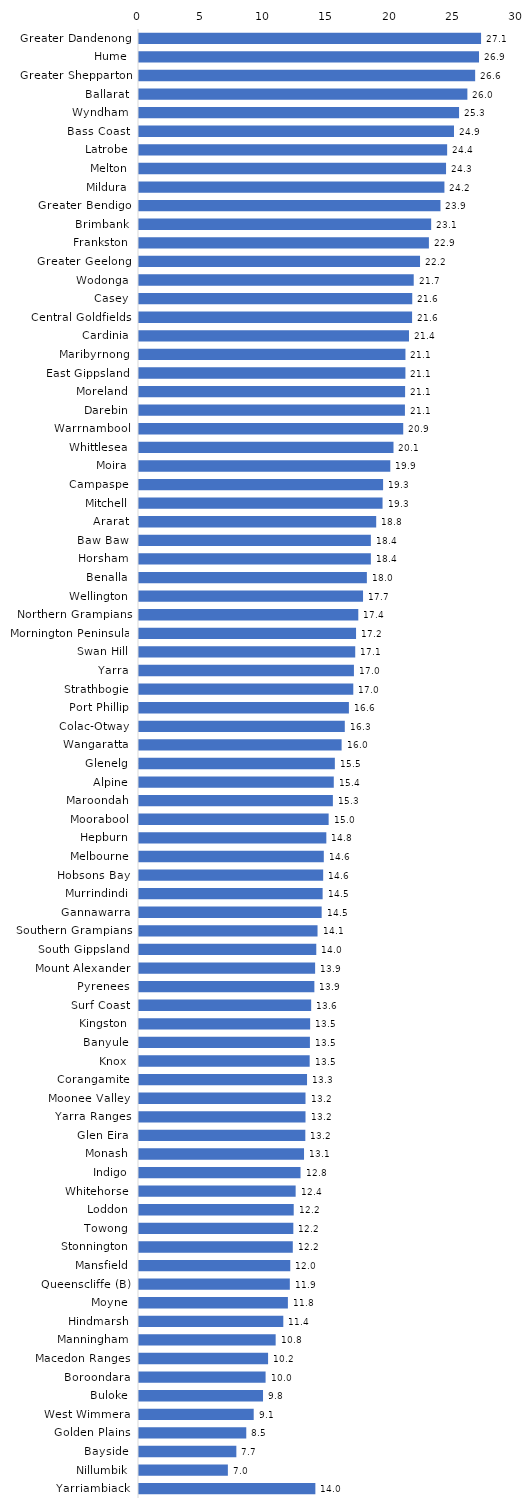
| Category | Series 0 |
|---|---|
| Greater Dandenong | 27.076 |
| Hume | 26.914 |
| Greater Shepparton | 26.609 |
| Ballarat | 25.993 |
| Wyndham | 25.334 |
| Bass Coast | 24.934 |
| Latrobe | 24.391 |
| Melton | 24.305 |
| Mildura | 24.176 |
| Greater Bendigo | 23.863 |
| Brimbank | 23.126 |
| Frankston | 22.948 |
| Greater Geelong | 22.245 |
| Wodonga | 21.746 |
| Casey | 21.629 |
| Central Goldfields | 21.616 |
| Cardinia | 21.371 |
| Maribyrnong | 21.092 |
| East Gippsland | 21.089 |
| Moreland | 21.064 |
| Darebin | 21.05 |
| Warrnambool | 20.915 |
| Whittlesea | 20.145 |
| Moira | 19.892 |
| Campaspe | 19.322 |
| Mitchell | 19.279 |
| Ararat | 18.776 |
| Baw Baw | 18.353 |
| Horsham | 18.353 |
| Benalla | 18.037 |
| Wellington | 17.734 |
| Northern Grampians | 17.359 |
| Mornington Peninsula | 17.181 |
| Swan Hill | 17.116 |
| Yarra | 17.013 |
| Strathbogie | 16.962 |
| Port Phillip | 16.615 |
| Colac-Otway | 16.29 |
| Wangaratta | 16.038 |
| Glenelg | 15.502 |
| Alpine | 15.418 |
| Maroondah | 15.347 |
| Moorabool | 15.011 |
| Hepburn | 14.828 |
| Melbourne | 14.628 |
| Hobsons Bay | 14.578 |
| Murrindindi | 14.535 |
| Gannawarra | 14.458 |
| Southern Grampians | 14.132 |
| South Gippsland | 14.033 |
| Mount Alexander | 13.941 |
| Pyrenees | 13.882 |
| Surf Coast | 13.628 |
| Kingston | 13.547 |
| Banyule | 13.529 |
| Knox | 13.51 |
| Corangamite | 13.301 |
| Moonee Valley | 13.18 |
| Yarra Ranges | 13.18 |
| Glen Eira | 13.165 |
| Monash | 13.063 |
| Indigo | 12.786 |
| Whitehorse | 12.4 |
| Loddon | 12.247 |
| Towong | 12.216 |
| Stonnington | 12.174 |
| Mansfield | 11.974 |
| Queenscliffe (B) | 11.939 |
| Moyne | 11.786 |
| Hindmarsh | 11.422 |
| Manningham | 10.817 |
| Macedon Ranges | 10.217 |
| Boroondara | 10.02 |
| Buloke | 9.817 |
| West Wimmera | 9.079 |
| Golden Plains | 8.491 |
| Bayside | 7.706 |
| Nillumbik | 7.035 |
| Yarriambiack | 13.96 |